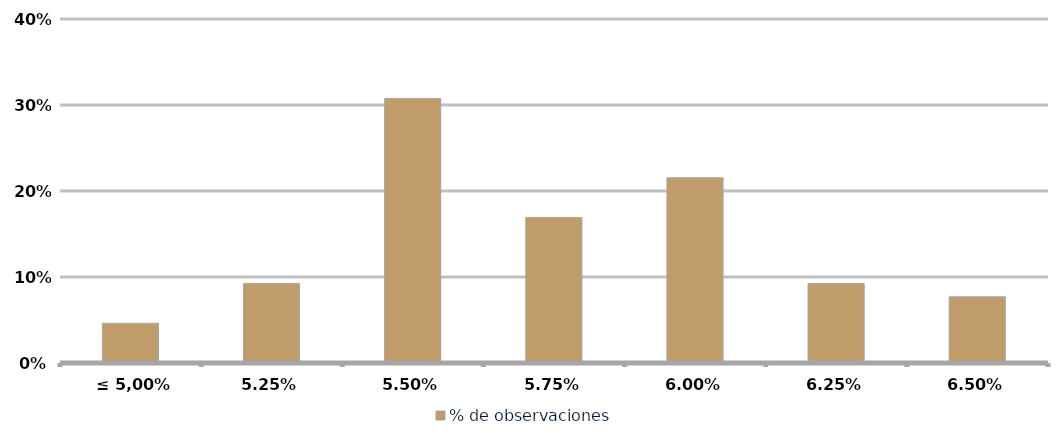
| Category | % de observaciones  |
|---|---|
|  ≤ 5,00% | 0.046 |
| 5,25% | 0.092 |
| 5,50% | 0.308 |
| 5,75% | 0.169 |
| 6,00% | 0.215 |
| 6,25% | 0.092 |
| 6,50% | 0.077 |